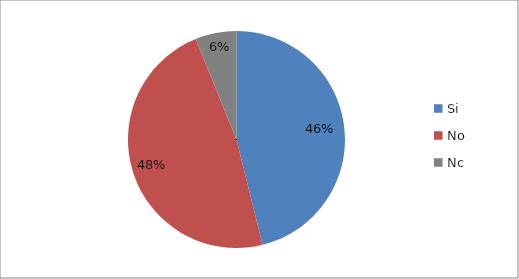
| Category | Series 0 | Series 1 | Series 2 |
|---|---|---|---|
| Si |  |  | 173 |
| No |  |  | 179 |
| Nc |  |  | 23 |